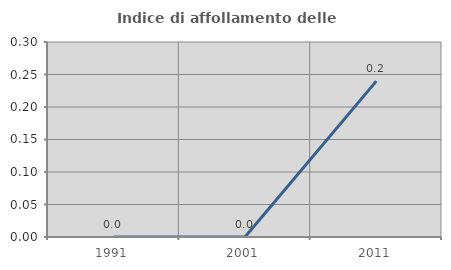
| Category | Indice di affollamento delle abitazioni  |
|---|---|
| 1991.0 | 0 |
| 2001.0 | 0 |
| 2011.0 | 0.24 |